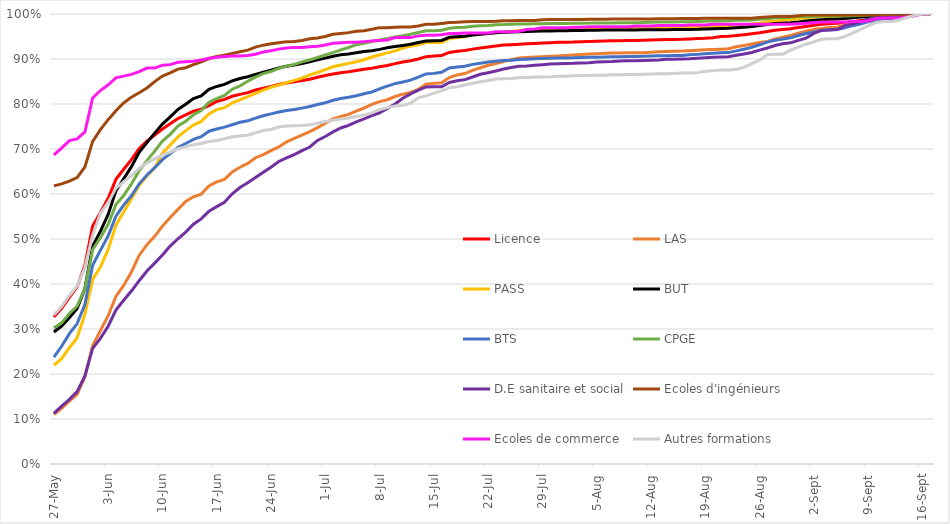
| Category | Licence | LAS | PASS | BUT | BTS | CPGE | D.E sanitaire et social | Ecoles d'ingénieurs | Ecoles de commerce | Autres formations |
|---|---|---|---|---|---|---|---|---|---|---|
| 2021-05-27 | 0.327 | 0.11 | 0.219 | 0.293 | 0.237 | 0.302 | 0.113 | 0.618 | 0.687 | 0.331 |
| 2021-05-28 | 0.346 | 0.123 | 0.234 | 0.306 | 0.262 | 0.314 | 0.129 | 0.622 | 0.702 | 0.35 |
| 2021-05-29 | 0.37 | 0.14 | 0.258 | 0.325 | 0.29 | 0.334 | 0.144 | 0.629 | 0.719 | 0.374 |
| 2021-05-30 | 0.394 | 0.155 | 0.281 | 0.345 | 0.312 | 0.351 | 0.161 | 0.637 | 0.723 | 0.396 |
| 2021-05-31 | 0.442 | 0.194 | 0.333 | 0.39 | 0.354 | 0.39 | 0.196 | 0.66 | 0.738 | 0.437 |
| 2021-06-01 | 0.529 | 0.263 | 0.41 | 0.484 | 0.442 | 0.476 | 0.257 | 0.717 | 0.813 | 0.509 |
| 2021-06-02 | 0.558 | 0.296 | 0.438 | 0.517 | 0.475 | 0.503 | 0.279 | 0.743 | 0.83 | 0.557 |
| 2021-06-03 | 0.591 | 0.33 | 0.476 | 0.555 | 0.507 | 0.533 | 0.306 | 0.765 | 0.843 | 0.581 |
| 2021-06-04 | 0.633 | 0.372 | 0.531 | 0.607 | 0.551 | 0.577 | 0.342 | 0.785 | 0.858 | 0.612 |
| 2021-06-05 | 0.655 | 0.397 | 0.56 | 0.634 | 0.575 | 0.596 | 0.364 | 0.802 | 0.862 | 0.627 |
| 2021-06-06 | 0.676 | 0.427 | 0.589 | 0.661 | 0.596 | 0.622 | 0.384 | 0.815 | 0.866 | 0.641 |
| 2021-06-07 | 0.701 | 0.463 | 0.62 | 0.693 | 0.623 | 0.652 | 0.407 | 0.825 | 0.872 | 0.657 |
| 2021-06-08 | 0.717 | 0.487 | 0.64 | 0.714 | 0.642 | 0.674 | 0.429 | 0.836 | 0.88 | 0.669 |
| 2021-06-09 | 0.731 | 0.506 | 0.657 | 0.735 | 0.658 | 0.695 | 0.446 | 0.85 | 0.88 | 0.678 |
| 2021-06-10 | 0.745 | 0.529 | 0.691 | 0.755 | 0.676 | 0.717 | 0.465 | 0.862 | 0.886 | 0.686 |
| 2021-06-11 | 0.756 | 0.548 | 0.709 | 0.772 | 0.69 | 0.733 | 0.484 | 0.869 | 0.887 | 0.693 |
| 2021-06-12 | 0.768 | 0.566 | 0.727 | 0.788 | 0.703 | 0.751 | 0.5 | 0.878 | 0.893 | 0.701 |
| 2021-06-13 | 0.776 | 0.584 | 0.741 | 0.799 | 0.712 | 0.762 | 0.515 | 0.881 | 0.894 | 0.705 |
| 2021-06-14 | 0.784 | 0.594 | 0.753 | 0.812 | 0.721 | 0.776 | 0.533 | 0.888 | 0.895 | 0.709 |
| 2021-06-15 | 0.789 | 0.6 | 0.761 | 0.818 | 0.727 | 0.786 | 0.545 | 0.894 | 0.898 | 0.712 |
| 2021-06-16 | 0.796 | 0.618 | 0.778 | 0.833 | 0.74 | 0.804 | 0.562 | 0.901 | 0.902 | 0.717 |
| 2021-06-17 | 0.806 | 0.627 | 0.788 | 0.839 | 0.744 | 0.812 | 0.572 | 0.905 | 0.904 | 0.719 |
| 2021-06-18 | 0.81 | 0.633 | 0.792 | 0.844 | 0.749 | 0.819 | 0.581 | 0.909 | 0.905 | 0.723 |
| 2021-06-19 | 0.817 | 0.649 | 0.802 | 0.851 | 0.754 | 0.833 | 0.601 | 0.912 | 0.907 | 0.727 |
| 2021-06-20 | 0.821 | 0.659 | 0.809 | 0.857 | 0.759 | 0.84 | 0.614 | 0.916 | 0.907 | 0.729 |
| 2021-06-21 | 0.825 | 0.668 | 0.817 | 0.861 | 0.763 | 0.851 | 0.625 | 0.92 | 0.908 | 0.731 |
| 2021-06-22 | 0.831 | 0.681 | 0.824 | 0.866 | 0.769 | 0.86 | 0.637 | 0.926 | 0.91 | 0.736 |
| 2021-06-23 | 0.835 | 0.687 | 0.831 | 0.871 | 0.774 | 0.868 | 0.648 | 0.931 | 0.916 | 0.741 |
| 2021-06-24 | 0.839 | 0.696 | 0.837 | 0.875 | 0.778 | 0.872 | 0.66 | 0.934 | 0.918 | 0.743 |
| 2021-06-25 | 0.843 | 0.705 | 0.842 | 0.88 | 0.782 | 0.879 | 0.672 | 0.936 | 0.922 | 0.749 |
| 2021-06-26 | 0.847 | 0.716 | 0.847 | 0.884 | 0.786 | 0.884 | 0.68 | 0.938 | 0.925 | 0.751 |
| 2021-06-27 | 0.849 | 0.724 | 0.853 | 0.887 | 0.788 | 0.888 | 0.688 | 0.939 | 0.926 | 0.752 |
| 2021-06-28 | 0.852 | 0.731 | 0.857 | 0.89 | 0.791 | 0.894 | 0.696 | 0.941 | 0.926 | 0.752 |
| 2021-06-29 | 0.855 | 0.738 | 0.865 | 0.894 | 0.794 | 0.898 | 0.704 | 0.945 | 0.927 | 0.754 |
| 2021-06-30 | 0.859 | 0.747 | 0.87 | 0.898 | 0.799 | 0.903 | 0.719 | 0.947 | 0.928 | 0.757 |
| 2021-07-01 | 0.863 | 0.758 | 0.877 | 0.902 | 0.803 | 0.909 | 0.728 | 0.95 | 0.931 | 0.761 |
| 2021-07-02 | 0.867 | 0.767 | 0.883 | 0.906 | 0.808 | 0.914 | 0.738 | 0.955 | 0.935 | 0.764 |
| 2021-07-03 | 0.869 | 0.772 | 0.887 | 0.909 | 0.812 | 0.92 | 0.747 | 0.957 | 0.936 | 0.767 |
| 2021-07-04 | 0.872 | 0.777 | 0.89 | 0.911 | 0.815 | 0.926 | 0.753 | 0.959 | 0.937 | 0.769 |
| 2021-07-05 | 0.874 | 0.784 | 0.894 | 0.914 | 0.818 | 0.932 | 0.76 | 0.962 | 0.937 | 0.772 |
| 2021-07-06 | 0.877 | 0.791 | 0.898 | 0.917 | 0.823 | 0.935 | 0.767 | 0.963 | 0.939 | 0.775 |
| 2021-07-07 | 0.879 | 0.799 | 0.905 | 0.919 | 0.827 | 0.939 | 0.774 | 0.966 | 0.94 | 0.78 |
| 2021-07-08 | 0.883 | 0.805 | 0.909 | 0.921 | 0.834 | 0.942 | 0.781 | 0.97 | 0.941 | 0.787 |
| 2021-07-09 | 0.886 | 0.81 | 0.914 | 0.925 | 0.84 | 0.945 | 0.79 | 0.97 | 0.942 | 0.792 |
| 2021-07-10 | 0.89 | 0.817 | 0.918 | 0.928 | 0.845 | 0.949 | 0.8 | 0.97 | 0.948 | 0.796 |
| 2021-07-11 | 0.893 | 0.822 | 0.924 | 0.93 | 0.849 | 0.952 | 0.813 | 0.971 | 0.948 | 0.797 |
| 2021-07-12 | 0.896 | 0.826 | 0.929 | 0.933 | 0.853 | 0.955 | 0.822 | 0.971 | 0.948 | 0.802 |
| 2021-07-13 | 0.9 | 0.833 | 0.932 | 0.936 | 0.86 | 0.959 | 0.831 | 0.973 | 0.951 | 0.814 |
| 2021-07-14 | 0.905 | 0.844 | 0.937 | 0.94 | 0.867 | 0.963 | 0.838 | 0.977 | 0.953 | 0.818 |
| 2021-07-15 | 0.907 | 0.846 | 0.937 | 0.941 | 0.868 | 0.963 | 0.838 | 0.977 | 0.953 | 0.824 |
| 2021-07-16 | 0.908 | 0.847 | 0.937 | 0.941 | 0.871 | 0.964 | 0.838 | 0.979 | 0.954 | 0.83 |
| 2021-07-17 | 0.915 | 0.859 | 0.946 | 0.948 | 0.88 | 0.968 | 0.848 | 0.981 | 0.957 | 0.836 |
| 2021-07-18 | 0.917 | 0.865 | 0.948 | 0.949 | 0.882 | 0.97 | 0.852 | 0.981 | 0.957 | 0.838 |
| 2021-07-19 | 0.919 | 0.868 | 0.949 | 0.951 | 0.884 | 0.971 | 0.854 | 0.983 | 0.958 | 0.842 |
| 2021-07-20 | 0.922 | 0.875 | 0.954 | 0.953 | 0.888 | 0.973 | 0.86 | 0.983 | 0.958 | 0.846 |
| 2021-07-21 | 0.924 | 0.881 | 0.955 | 0.955 | 0.891 | 0.974 | 0.866 | 0.983 | 0.958 | 0.85 |
| 2021-07-22 | 0.927 | 0.886 | 0.957 | 0.957 | 0.893 | 0.974 | 0.87 | 0.983 | 0.958 | 0.852 |
| 2021-07-23 | 0.929 | 0.89 | 0.959 | 0.958 | 0.895 | 0.976 | 0.873 | 0.984 | 0.96 | 0.855 |
| 2021-07-24 | 0.931 | 0.894 | 0.96 | 0.96 | 0.897 | 0.976 | 0.878 | 0.985 | 0.96 | 0.856 |
| 2021-07-25 | 0.932 | 0.899 | 0.961 | 0.96 | 0.897 | 0.977 | 0.881 | 0.985 | 0.96 | 0.856 |
| 2021-07-26 | 0.933 | 0.902 | 0.963 | 0.961 | 0.899 | 0.978 | 0.884 | 0.986 | 0.962 | 0.858 |
| 2021-07-27 | 0.934 | 0.903 | 0.965 | 0.961 | 0.899 | 0.978 | 0.884 | 0.986 | 0.965 | 0.859 |
| 2021-07-28 | 0.934 | 0.904 | 0.966 | 0.962 | 0.9 | 0.978 | 0.886 | 0.986 | 0.967 | 0.86 |
| 2021-07-29 | 0.935 | 0.905 | 0.966 | 0.962 | 0.901 | 0.978 | 0.887 | 0.987 | 0.969 | 0.86 |
| 2021-07-30 | 0.936 | 0.906 | 0.967 | 0.962 | 0.902 | 0.979 | 0.889 | 0.988 | 0.969 | 0.861 |
| 2021-07-31 | 0.937 | 0.907 | 0.967 | 0.963 | 0.902 | 0.979 | 0.889 | 0.988 | 0.969 | 0.862 |
| 2021-08-01 | 0.937 | 0.908 | 0.967 | 0.963 | 0.902 | 0.979 | 0.89 | 0.988 | 0.969 | 0.862 |
| 2021-08-02 | 0.938 | 0.909 | 0.967 | 0.963 | 0.903 | 0.979 | 0.89 | 0.988 | 0.971 | 0.863 |
| 2021-08-03 | 0.938 | 0.91 | 0.968 | 0.963 | 0.903 | 0.98 | 0.891 | 0.988 | 0.971 | 0.863 |
| 2021-08-04 | 0.939 | 0.911 | 0.969 | 0.964 | 0.904 | 0.98 | 0.892 | 0.988 | 0.972 | 0.864 |
| 2021-08-05 | 0.939 | 0.912 | 0.969 | 0.964 | 0.904 | 0.98 | 0.893 | 0.988 | 0.972 | 0.864 |
| 2021-08-06 | 0.94 | 0.913 | 0.969 | 0.964 | 0.904 | 0.98 | 0.894 | 0.988 | 0.972 | 0.864 |
| 2021-08-07 | 0.94 | 0.913 | 0.969 | 0.965 | 0.905 | 0.98 | 0.895 | 0.989 | 0.972 | 0.865 |
| 2021-08-08 | 0.941 | 0.914 | 0.97 | 0.965 | 0.905 | 0.981 | 0.896 | 0.989 | 0.972 | 0.865 |
| 2021-08-09 | 0.941 | 0.914 | 0.97 | 0.965 | 0.905 | 0.981 | 0.896 | 0.989 | 0.972 | 0.865 |
| 2021-08-10 | 0.941 | 0.914 | 0.97 | 0.965 | 0.906 | 0.981 | 0.896 | 0.989 | 0.973 | 0.866 |
| 2021-08-11 | 0.942 | 0.914 | 0.97 | 0.965 | 0.906 | 0.981 | 0.897 | 0.989 | 0.973 | 0.866 |
| 2021-08-12 | 0.942 | 0.915 | 0.97 | 0.965 | 0.907 | 0.982 | 0.897 | 0.989 | 0.973 | 0.867 |
| 2021-08-13 | 0.943 | 0.916 | 0.97 | 0.965 | 0.907 | 0.982 | 0.898 | 0.989 | 0.974 | 0.867 |
| 2021-08-14 | 0.943 | 0.917 | 0.97 | 0.965 | 0.907 | 0.982 | 0.899 | 0.989 | 0.974 | 0.867 |
| 2021-08-15 | 0.943 | 0.917 | 0.971 | 0.965 | 0.908 | 0.982 | 0.9 | 0.989 | 0.974 | 0.868 |
| 2021-08-16 | 0.944 | 0.918 | 0.971 | 0.966 | 0.908 | 0.983 | 0.9 | 0.99 | 0.974 | 0.869 |
| 2021-08-17 | 0.944 | 0.918 | 0.971 | 0.966 | 0.909 | 0.983 | 0.9 | 0.99 | 0.976 | 0.869 |
| 2021-08-18 | 0.945 | 0.919 | 0.971 | 0.966 | 0.91 | 0.983 | 0.902 | 0.99 | 0.976 | 0.87 |
| 2021-08-19 | 0.946 | 0.92 | 0.972 | 0.967 | 0.912 | 0.984 | 0.903 | 0.991 | 0.976 | 0.873 |
| 2021-08-20 | 0.947 | 0.921 | 0.972 | 0.967 | 0.913 | 0.984 | 0.904 | 0.991 | 0.977 | 0.874 |
| 2021-08-21 | 0.95 | 0.922 | 0.972 | 0.968 | 0.914 | 0.985 | 0.905 | 0.991 | 0.977 | 0.875 |
| 2021-08-22 | 0.951 | 0.923 | 0.972 | 0.968 | 0.914 | 0.985 | 0.905 | 0.991 | 0.977 | 0.875 |
| 2021-08-23 | 0.952 | 0.927 | 0.974 | 0.97 | 0.918 | 0.986 | 0.908 | 0.991 | 0.977 | 0.877 |
| 2021-08-24 | 0.954 | 0.93 | 0.976 | 0.97 | 0.922 | 0.986 | 0.911 | 0.991 | 0.977 | 0.882 |
| 2021-08-25 | 0.956 | 0.933 | 0.978 | 0.972 | 0.926 | 0.987 | 0.914 | 0.991 | 0.977 | 0.89 |
| 2021-08-26 | 0.958 | 0.937 | 0.979 | 0.974 | 0.932 | 0.988 | 0.92 | 0.992 | 0.977 | 0.897 |
| 2021-08-27 | 0.961 | 0.939 | 0.983 | 0.977 | 0.937 | 0.989 | 0.924 | 0.993 | 0.977 | 0.909 |
| 2021-08-28 | 0.964 | 0.945 | 0.984 | 0.979 | 0.942 | 0.991 | 0.93 | 0.994 | 0.977 | 0.91 |
| 2021-08-29 | 0.966 | 0.948 | 0.986 | 0.98 | 0.944 | 0.992 | 0.934 | 0.994 | 0.977 | 0.911 |
| 2021-08-30 | 0.967 | 0.952 | 0.988 | 0.981 | 0.947 | 0.993 | 0.936 | 0.994 | 0.977 | 0.92 |
| 2021-08-31 | 0.97 | 0.958 | 0.99 | 0.982 | 0.952 | 0.994 | 0.941 | 0.996 | 0.978 | 0.926 |
| 2021-09-01 | 0.972 | 0.962 | 0.992 | 0.984 | 0.957 | 0.995 | 0.946 | 0.998 | 0.98 | 0.933 |
| 2021-09-02 | 0.975 | 0.966 | 0.993 | 0.986 | 0.96 | 0.995 | 0.957 | 0.998 | 0.981 | 0.938 |
| 2021-09-03 | 0.977 | 0.968 | 0.994 | 0.987 | 0.964 | 0.995 | 0.963 | 0.998 | 0.982 | 0.944 |
| 2021-09-04 | 0.979 | 0.97 | 0.994 | 0.988 | 0.965 | 0.995 | 0.964 | 0.998 | 0.982 | 0.945 |
| 2021-09-05 | 0.979 | 0.971 | 0.994 | 0.989 | 0.965 | 0.995 | 0.965 | 0.998 | 0.982 | 0.945 |
| 2021-09-06 | 0.981 | 0.975 | 0.995 | 0.99 | 0.969 | 0.996 | 0.974 | 0.998 | 0.982 | 0.95 |
| 2021-09-07 | 0.983 | 0.978 | 0.996 | 0.992 | 0.974 | 0.996 | 0.978 | 0.998 | 0.983 | 0.957 |
| 2021-09-08 | 0.985 | 0.982 | 0.997 | 0.993 | 0.978 | 0.997 | 0.983 | 0.998 | 0.983 | 0.966 |
| 2021-09-09 | 0.988 | 0.985 | 0.998 | 0.994 | 0.983 | 0.998 | 0.988 | 0.998 | 0.985 | 0.973 |
| 2021-09-10 | 0.99 | 0.989 | 0.998 | 0.996 | 0.986 | 0.998 | 0.992 | 0.998 | 0.99 | 0.981 |
| 2021-09-11 | 0.991 | 0.991 | 0.998 | 0.996 | 0.987 | 0.998 | 0.992 | 0.999 | 0.991 | 0.983 |
| 2021-09-12 | 0.992 | 0.993 | 0.998 | 0.997 | 0.987 | 0.998 | 0.992 | 0.999 | 0.991 | 0.983 |
| 2021-09-13 | 0.993 | 0.995 | 0.999 | 0.998 | 0.99 | 0.999 | 0.996 | 0.999 | 0.991 | 0.987 |
| 2021-09-14 | 0.996 | 0.997 | 1 | 0.999 | 0.995 | 0.999 | 0.997 | 0.999 | 0.994 | 0.992 |
| 2021-09-15 | 0.998 | 0.999 | 1 | 1 | 0.998 | 1 | 0.999 | 1 | 0.996 | 0.997 |
| 2021-09-16 | 1 | 1 | 1 | 1 | 1 | 1 | 1 | 1 | 1 | 1 |
| 2021-09-17 | 1 | 1 | 1 | 1 | 1 | 1 | 1 | 1 | 1 | 1 |